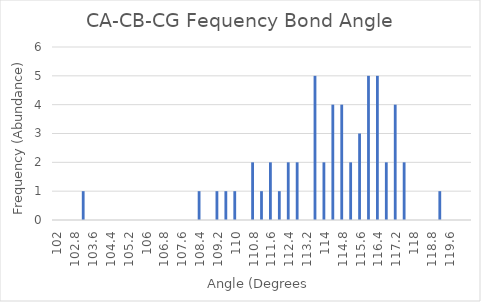
| Category | Series 0 |
|---|---|
| 102.0 | 0 |
| 102.4 | 0 |
| 102.80000000000001 | 0 |
| 103.20000000000002 | 1 |
| 103.60000000000002 | 0 |
| 104.00000000000003 | 0 |
| 104.40000000000003 | 0 |
| 104.80000000000004 | 0 |
| 105.20000000000005 | 0 |
| 105.60000000000005 | 0 |
| 106.00000000000006 | 0 |
| 106.40000000000006 | 0 |
| 106.80000000000007 | 0 |
| 107.20000000000007 | 0 |
| 107.60000000000008 | 0 |
| 108.00000000000009 | 0 |
| 108.40000000000009 | 1 |
| 108.8000000000001 | 0 |
| 109.2000000000001 | 1 |
| 109.60000000000011 | 1 |
| 110.00000000000011 | 1 |
| 110.40000000000012 | 0 |
| 110.80000000000013 | 2 |
| 111.20000000000013 | 1 |
| 111.60000000000014 | 2 |
| 112.00000000000014 | 1 |
| 112.40000000000015 | 2 |
| 112.80000000000015 | 2 |
| 113.20000000000016 | 0 |
| 113.60000000000016 | 5 |
| 114.00000000000017 | 2 |
| 114.40000000000018 | 4 |
| 114.80000000000018 | 4 |
| 115.20000000000019 | 2 |
| 115.6000000000002 | 3 |
| 116.0000000000002 | 5 |
| 116.4000000000002 | 5 |
| 116.80000000000021 | 2 |
| 117.20000000000022 | 4 |
| 117.60000000000022 | 2 |
| 118.00000000000023 | 0 |
| 118.40000000000023 | 0 |
| 118.80000000000024 | 0 |
| 119.20000000000024 | 1 |
| 119.60000000000025 | 0 |
| 120.00000000000026 | 0 |